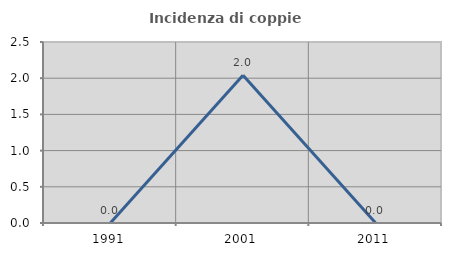
| Category | Incidenza di coppie miste |
|---|---|
| 1991.0 | 0 |
| 2001.0 | 2.041 |
| 2011.0 | 0 |